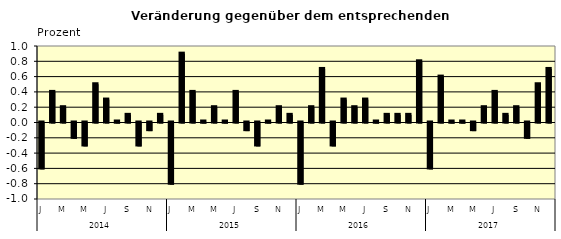
| Category | Series 0 |
|---|---|
| 0 | -0.6 |
| 1 | 0.4 |
| 2 | 0.2 |
| 3 | -0.2 |
| 4 | -0.3 |
| 5 | 0.5 |
| 6 | 0.3 |
| 7 | 0.01 |
| 8 | 0.1 |
| 9 | -0.3 |
| 10 | -0.1 |
| 11 | 0.1 |
| 12 | -0.8 |
| 13 | 0.9 |
| 14 | 0.4 |
| 15 | 0.01 |
| 16 | 0.2 |
| 17 | 0.01 |
| 18 | 0.4 |
| 19 | -0.1 |
| 20 | -0.3 |
| 21 | 0.01 |
| 22 | 0.2 |
| 23 | 0.1 |
| 24 | -0.8 |
| 25 | 0.2 |
| 26 | 0.7 |
| 27 | -0.3 |
| 28 | 0.3 |
| 29 | 0.2 |
| 30 | 0.3 |
| 31 | 0.01 |
| 32 | 0.1 |
| 33 | 0.1 |
| 34 | 0.1 |
| 35 | 0.8 |
| 36 | -0.6 |
| 37 | 0.6 |
| 38 | 0.01 |
| 39 | 0.01 |
| 40 | -0.1 |
| 41 | 0.2 |
| 42 | 0.4 |
| 43 | 0.1 |
| 44 | 0.2 |
| 45 | -0.2 |
| 46 | 0.5 |
| 47 | 0.7 |